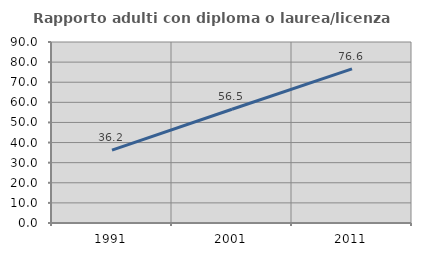
| Category | Rapporto adulti con diploma o laurea/licenza media  |
|---|---|
| 1991.0 | 36.229 |
| 2001.0 | 56.548 |
| 2011.0 | 76.639 |